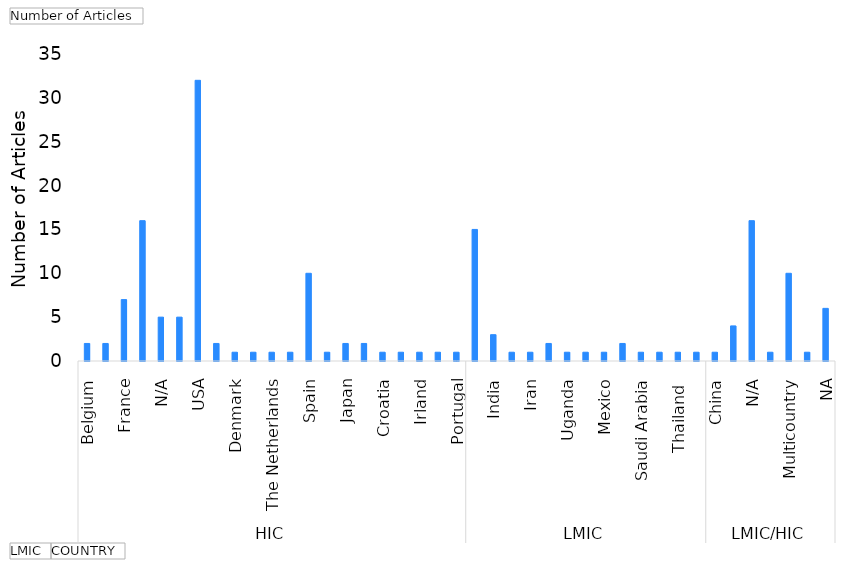
| Category | Total |
|---|---|
| 0 | 2 |
| 1 | 2 |
| 2 | 7 |
| 3 | 16 |
| 4 | 5 |
| 5 | 5 |
| 6 | 32 |
| 7 | 2 |
| 8 | 1 |
| 9 | 1 |
| 10 | 1 |
| 11 | 1 |
| 12 | 10 |
| 13 | 1 |
| 14 | 2 |
| 15 | 2 |
| 16 | 1 |
| 17 | 1 |
| 18 | 1 |
| 19 | 1 |
| 20 | 1 |
| 21 | 15 |
| 22 | 3 |
| 23 | 1 |
| 24 | 1 |
| 25 | 2 |
| 26 | 1 |
| 27 | 1 |
| 28 | 1 |
| 29 | 2 |
| 30 | 1 |
| 31 | 1 |
| 32 | 1 |
| 33 | 1 |
| 34 | 1 |
| 35 | 4 |
| 36 | 16 |
| 37 | 1 |
| 38 | 10 |
| 39 | 1 |
| 40 | 6 |